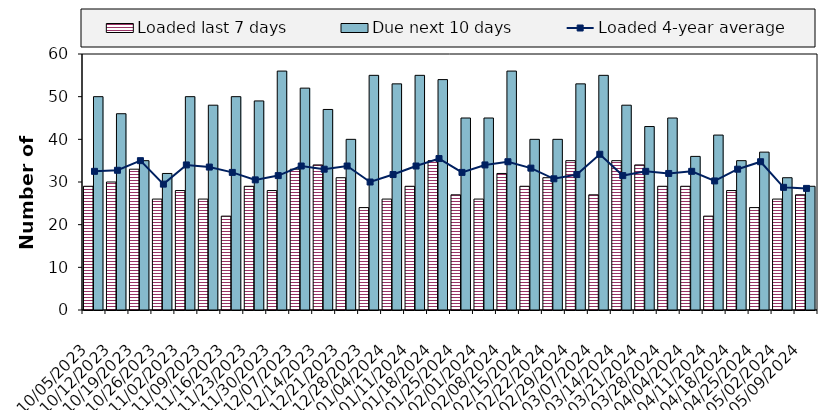
| Category | Loaded last 7 days | Due next 10 days |
|---|---|---|
| 10/05/2023 | 29 | 50 |
| 10/12/2023 | 30 | 46 |
| 10/19/2023 | 33 | 35 |
| 10/26/2023 | 26 | 32 |
| 11/02/2023 | 28 | 50 |
| 11/09/2023 | 26 | 48 |
| 11/16/2023 | 22 | 50 |
| 11/23/2023 | 29 | 49 |
| 11/30/2023 | 28 | 56 |
| 12/07/2023 | 33 | 52 |
| 12/14/2023 | 34 | 47 |
| 12/21/2023 | 31 | 40 |
| 12/28/2023 | 24 | 55 |
| 01/04/2024 | 26 | 53 |
| 01/11/2024 | 29 | 55 |
| 01/18/2024 | 35 | 54 |
| 01/25/2024 | 27 | 45 |
| 02/01/2024 | 26 | 45 |
| 02/08/2024 | 32 | 56 |
| 02/15/2024 | 29 | 40 |
| 02/22/2024 | 31 | 40 |
| 02/29/2024 | 35 | 53 |
| 03/07/2024 | 27 | 55 |
| 03/14/2024 | 35 | 48 |
| 03/21/2024 | 34 | 43 |
| 03/28/2024 | 29 | 45 |
| 04/04/2024 | 29 | 36 |
| 04/11/2024 | 22 | 41 |
| 04/18/2024 | 28 | 35 |
| 04/25/2024 | 24 | 37 |
| 05/02/2024 | 26 | 31 |
| 05/09/2024 | 27 | 29 |